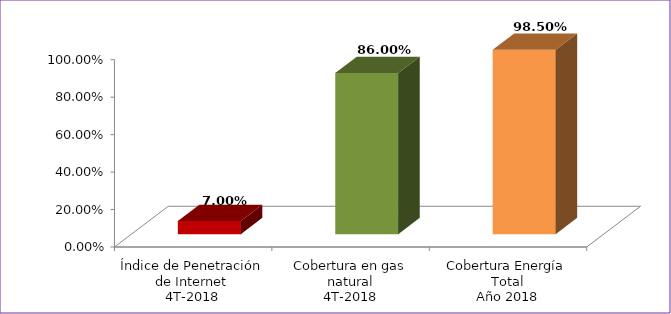
| Category | Series 0 |
|---|---|
| Índice de Penetración de Internet
4T-2018 | 0.07 |
| Cobertura en gas natural
4T-2018 | 0.86 |
| Cobertura Energía Total
Año 2018 | 0.985 |